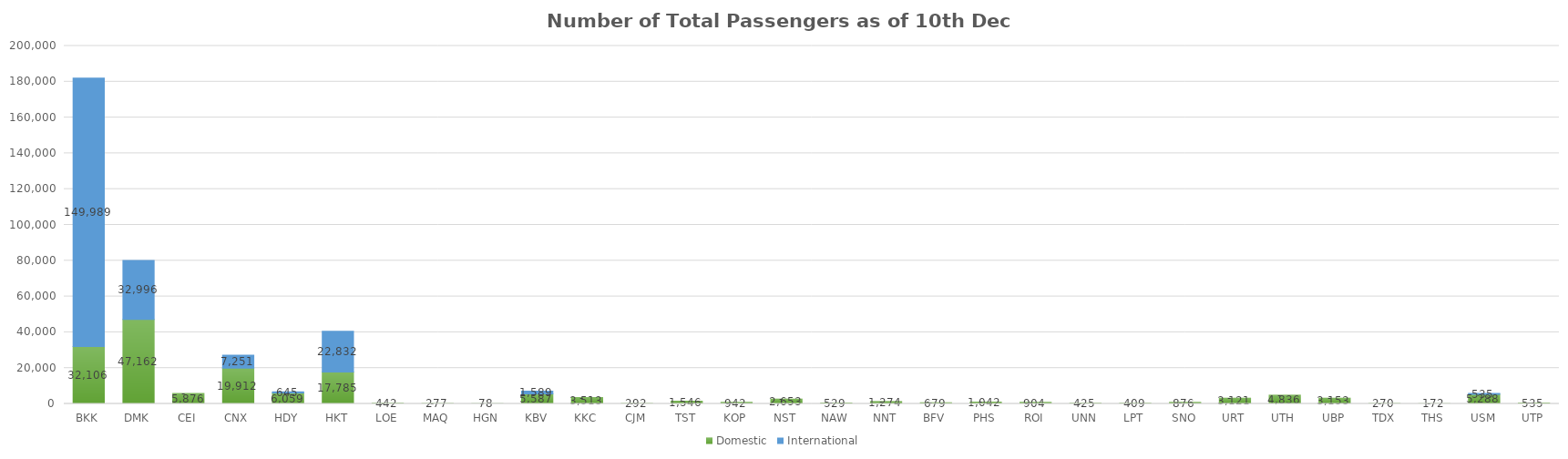
| Category | Domestic | International |
|---|---|---|
| BKK | 32106 | 149989 |
| DMK | 47162 | 32996 |
| CEI | 5876 | 0 |
| CNX | 19912 | 7251 |
| HDY | 6059 | 645 |
| HKT | 17785 | 22832 |
| LOE | 442 | 0 |
| MAQ | 277 | 0 |
| HGN | 78 | 0 |
| KBV | 5587 | 1589 |
| KKC | 3513 | 0 |
| CJM | 292 | 0 |
| TST | 1546 | 0 |
| KOP | 942 | 0 |
| NST | 2653 | 0 |
| NAW | 529 | 0 |
| NNT | 1274 | 0 |
| BFV | 679 | 0 |
| PHS | 1042 | 0 |
| ROI | 904 | 0 |
| UNN | 425 | 0 |
| LPT | 409 | 0 |
| SNO | 876 | 0 |
| URT | 3121 | 0 |
| UTH | 4836 | 0 |
| UBP | 3153 | 0 |
| TDX | 270 | 0 |
| THS | 172 | 0 |
| USM | 5288 | 535 |
| UTP | 535 | 0 |